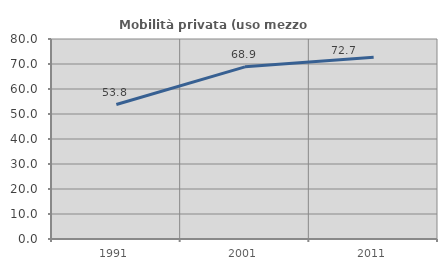
| Category | Mobilità privata (uso mezzo privato) |
|---|---|
| 1991.0 | 53.786 |
| 2001.0 | 68.854 |
| 2011.0 | 72.683 |